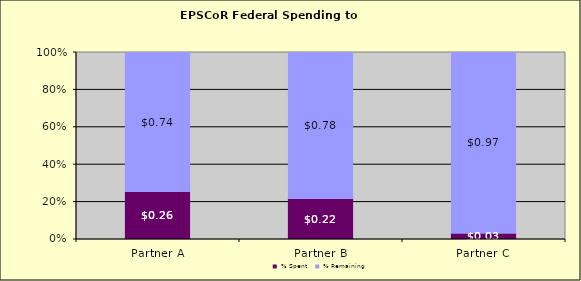
| Category | % Spent | % Remaining |
|---|---|---|
| Partner A | 0.256 | 0.744 |
| Partner B | 0.219 | 0.781 |
| Partner C | 0.034 | 0.966 |